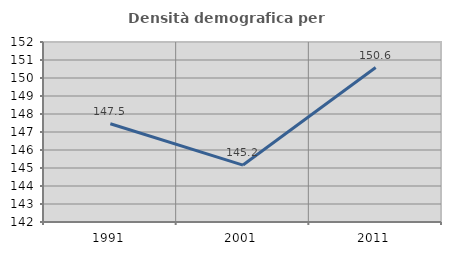
| Category | Densità demografica |
|---|---|
| 1991.0 | 147.458 |
| 2001.0 | 145.162 |
| 2011.0 | 150.582 |